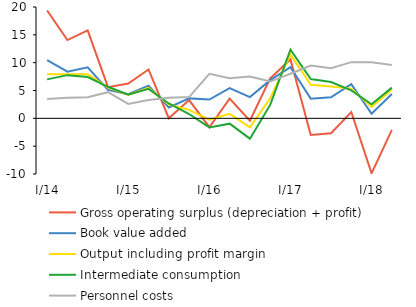
| Category | Gross operating surplus (depreciation + profit) | Book value added | Output including profit margin | Intermediate consumption | Personnel costs |
|---|---|---|---|---|---|
|  I/14 | 19.377 | 10.443 | 7.927 | 6.996 | 3.489 |
| II | 14.056 | 8.377 | 7.929 | 7.759 | 3.715 |
| III | 15.807 | 9.164 | 7.897 | 7.423 | 3.778 |
| IV | 5.608 | 5.099 | 5.518 | 5.667 | 4.703 |
|  I/15 | 6.258 | 4.33 | 4.267 | 4.242 | 2.6 |
|  II | 8.779 | 5.885 | 5.463 | 5.302 | 3.274 |
| III | 0.02 | 1.943 | 2.472 | 2.674 | 3.683 |
| IV | 3.287 | 3.585 | 1.515 | 0.78 | 3.819 |
|  I/16 | -1.596 | 3.373 | -0.248 | -1.632 | 7.994 |
| II | 3.541 | 5.412 | 0.805 | -0.957 | 7.192 |
| III | -0.43 | 3.809 | -1.61 | -3.654 | 7.507 |
| IV | 7.176 | 6.856 | 3.599 | 2.411 | 6.605 |
|  I/17 | 10.577 | 9.191 | 11.446 | 12.351 | 8.017 |
| II | -2.998 | 3.514 | 6.043 | 7.072 | 9.495 |
| III | -2.678 | 3.78 | 5.728 | 6.519 | 9 |
| IV | 1.133 | 6.149 | 5.336 | 5.027 | 10.09 |
|  I/18 | -9.879 | 0.811 | 2.053 | 2.538 | 10.082 |
| II | -2.066 | 4.367 | 5.192 | 5.516 | 9.601 |